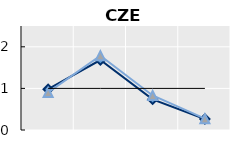
| Category | Né à l'étranger | Né dans le pays | Series 1 |
|---|---|---|---|
| 15-24 | 0.98 | 0.904 | 1 |
| 25-54 | 1.682 | 1.788 | 1 |
| 55-64 | 0.736 | 0.83 | 1 |
| 65+ | 0.264 | 0.272 | 1 |